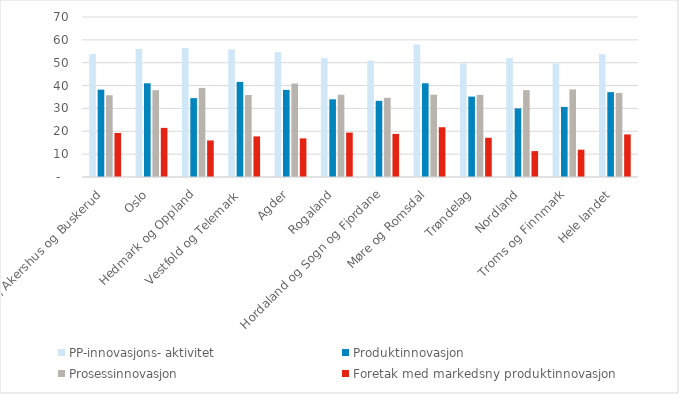
| Category | PP-innovasjons- aktivitet | Produktinnovasjon | Prosessinnovasjon | Foretak med markedsny produktinnovasjon |
|---|---|---|---|---|
| Østfold, Akershus og Buskerud | 53.772 | 38.228 | 35.772 | 19.277 |
| Oslo | 56 | 41 | 38 | 21.494 |
| Hedmark og Oppland | 56.453 | 34.516 | 38.968 | 16 |
| Vestfold og Telemark | 55.864 | 41.607 | 35.872 | 17.769 |
| Agder | 54.643 | 38.119 | 40.896 | 16.895 |
| Rogaland | 52 | 34 | 36 | 19.431 |
| Hordaland og Sogn og Fjordane | 50.874 | 33.324 | 34.648 | 18.85 |
| Møre og Romsdal | 58 | 41 | 36 | 21.777 |
| Trøndelag | 49.727 | 35.181 | 35.907 | 17.167 |
| Nordland | 52 | 30 | 38 | 11.332 |
| Troms og Finnmark | 49.657 | 30.671 | 38.314 | 11.947 |
| Hele landet | 53.762 | 37.126 | 36.784 | 18.621 |